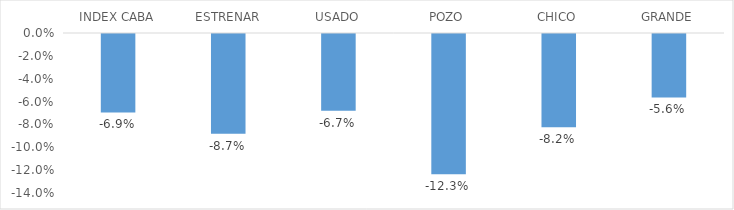
| Category | Series 0 |
|---|---|
| INDEX CABA | -0.069 |
| ESTRENAR | -0.087 |
| USADO | -0.067 |
| POZO | -0.123 |
| CHICO | -0.082 |
| GRANDE | -0.056 |